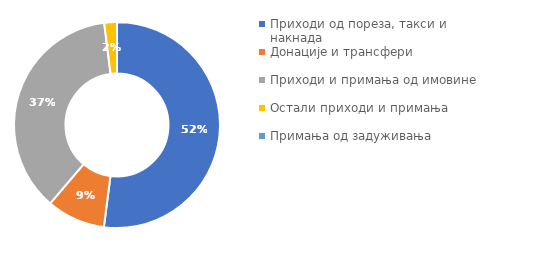
| Category | Series 0 |
|---|---|
| Приходи од пореза, такси и накнада | 107560 |
| Донације и трансфери | 19010 |
| Приходи и примања од имовине | 76023 |
| Остали приходи и примања | 4108 |
| Примања од задуживања | 0 |